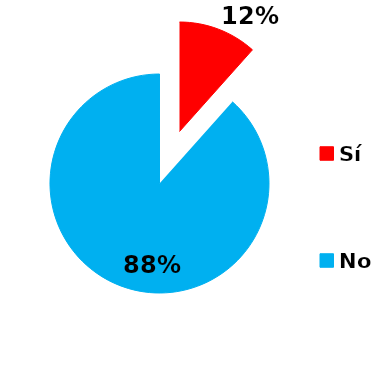
| Category | Series 0 |
|---|---|
| Sí | 29 |
| No | 221 |